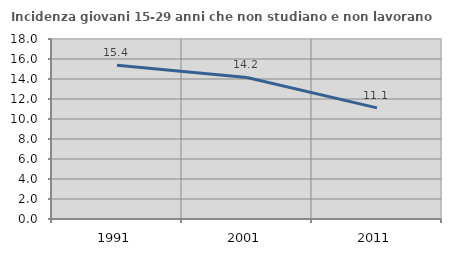
| Category | Incidenza giovani 15-29 anni che non studiano e non lavorano  |
|---|---|
| 1991.0 | 15.385 |
| 2001.0 | 14.151 |
| 2011.0 | 11.111 |